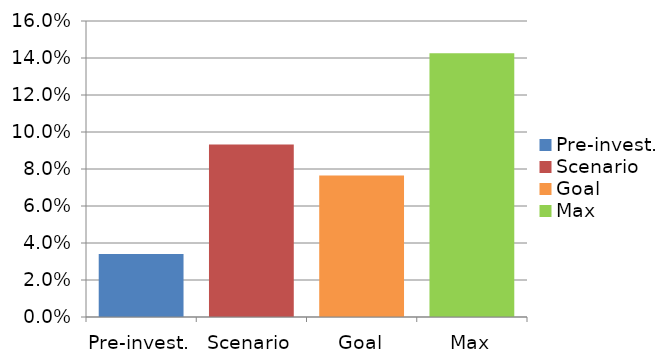
| Category | Series 0 |
|---|---|
| Pre-invest. | 0.034 |
| Scenario | 0.093 |
| Goal | 0.077 |
| Max | 0.143 |